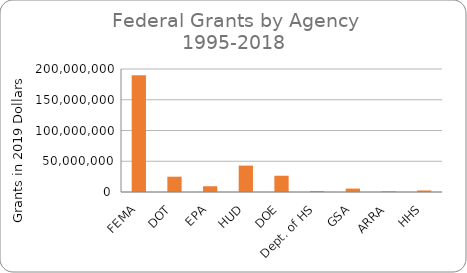
| Category | Series 0 |
|---|---|
| FEMA | 189970399.969 |
| DOT | 24855977 |
| EPA | 9355973 |
| HUD | 42921574 |
| DOE | 26430176 |
| Dept. of HS | 1429769 |
| GSA | 5536858 |
| ARRA | 1101262 |
| HHS | 2507167 |